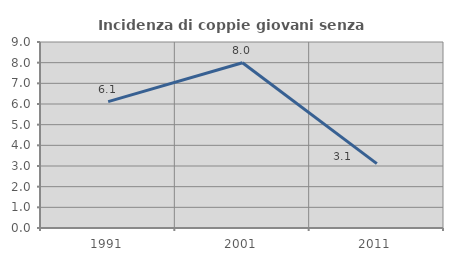
| Category | Incidenza di coppie giovani senza figli |
|---|---|
| 1991.0 | 6.114 |
| 2001.0 | 7.993 |
| 2011.0 | 3.114 |